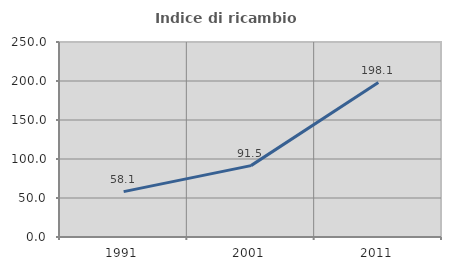
| Category | Indice di ricambio occupazionale  |
|---|---|
| 1991.0 | 58.15 |
| 2001.0 | 91.504 |
| 2011.0 | 198.061 |